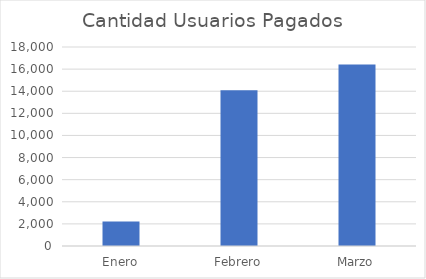
| Category | Cantidad Usuarios Pagados |
|---|---|
| Enero | 2212 |
| Febrero | 14079 |
| Marzo | 16418 |